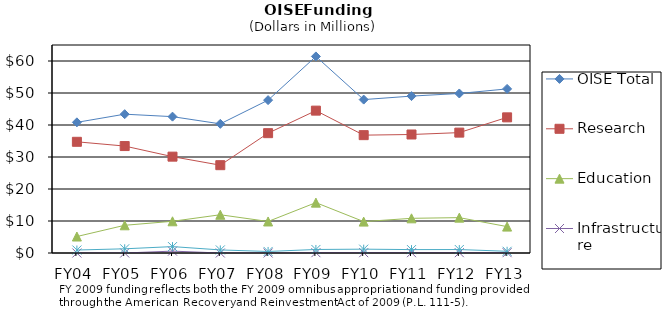
| Category | OISE Total | Research | Education | Infrastructure | Model Organization |
|---|---|---|---|---|---|
| FY04 | 40.83 | 34.75 | 5.15 | 0 | 0.93 |
| FY05 | 43.38 | 33.42 | 8.66 | 0 | 1.31 |
| FY06 | 42.61 | 30.11 | 9.91 | 0.59 | 2 |
| FY07 | 40.36 | 27.446 | 11.95 | 0 | 0.961 |
| FY08 | 47.77 | 37.45 | 9.85 | 0 | 0.48 |
| FY09 | 61.43 | 44.49 | 15.74 | 0.1 | 1.1 |
| FY10 | 47.94 | 36.83 | 9.81 | 0.1 | 1.2 |
| FY11 | 49.031 | 37.035 | 10.836 | 0.1 | 1.06 |
| FY12 | 49.85 | 37.62 | 11.05 | 0.1 | 1.08 |
| FY13 | 51.28 | 42.39 | 8.25 | 0.1 | 0.54 |